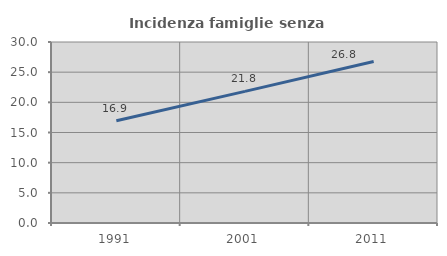
| Category | Incidenza famiglie senza nuclei |
|---|---|
| 1991.0 | 16.938 |
| 2001.0 | 21.811 |
| 2011.0 | 26.755 |